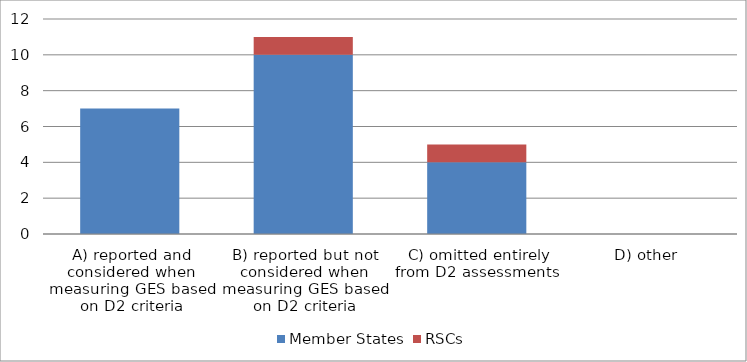
| Category | Member States | RSCs |
|---|---|---|
| A) reported and considered when measuring GES based on D2 criteria | 7 | 0 |
| B) reported but not considered when measuring GES based on D2 criteria | 10 | 1 |
| C) omitted entirely from D2 assessments  | 4 | 1 |
| D) other  | 0 | 0 |